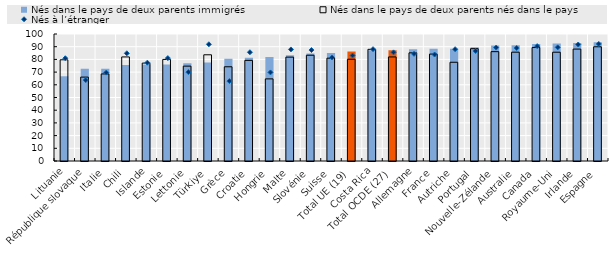
| Category | Nés dans le pays de deux parents immigrés | Nés dans le pays de deux parents nés dans le pays |
|---|---|---|
| Lituanie | 66.716 | 79.689 |
| République slovaque | 72.698 | 66.068 |
| Italie | 72.712 | 68.545 |
| Chili | 75.627 | 81.943 |
| Islande | 75.917 | 77.094 |
| Estonie | 76.064 | 79.98 |
| Lettonie | 77.019 | 74.698 |
| Türkiye | 77.465 | 83.633 |
| Grèce | 80.583 | 74.198 |
| Croatie | 81.223 | 79.228 |
| Hongrie | 81.872 | 64.664 |
| Malte | 83.217 | 81.787 |
| Slovénie | 84.668 | 83.281 |
| Suisse | 85.011 | 80.967 |
| Total UE (19) | 86.26 | 80.128 |
| Costa Rica | 87.119 | 87.92 |
| Total OCDE (27) | 87.298 | 81.928 |
| Allemagne | 88.026 | 85.166 |
| France | 88.345 | 84.18 |
| Autriche | 88.365 | 77.753 |
| Portugal | 89.652 | 88.441 |
| Nouvelle-Zélande | 90.987 | 86.106 |
| Australie | 91.103 | 85.68 |
| Canada | 92.209 | 89.342 |
| Royaume-Uni | 92.561 | 85.66 |
| Irlande | 92.986 | 88.116 |
| Espagne | 93.458 | 89.929 |